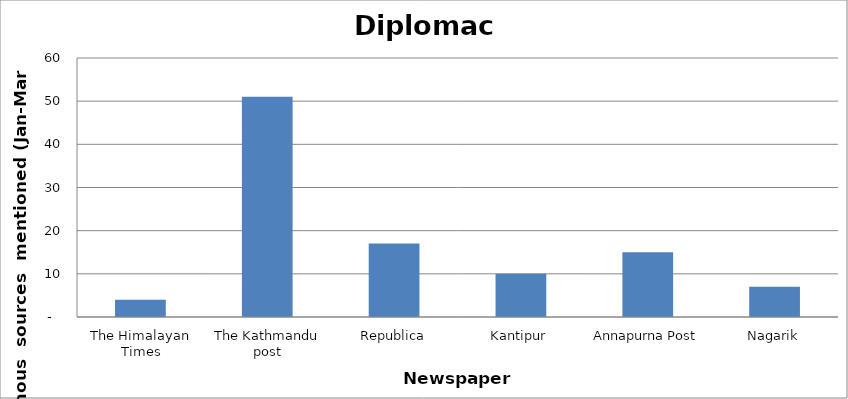
| Category | Diplomacy |
|---|---|
| The Himalayan Times | 4 |
| The Kathmandu post | 51 |
| Republica | 17 |
| Kantipur | 10 |
| Annapurna Post | 15 |
| Nagarik | 7 |